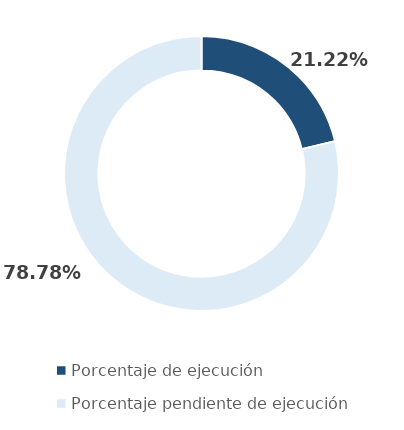
| Category | Series 0 |
|---|---|
| Porcentaje de ejecución | 0.212 |
| Porcentaje pendiente de ejecución | 0.788 |